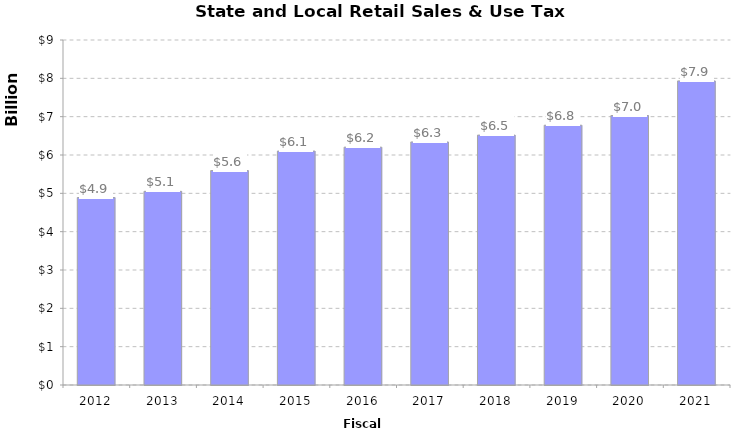
| Category | Series 0 |
|---|---|
| 2012.0 | 4891193000 |
| 2013.0 | 5052117000 |
| 2014.0 | 5594644000 |
| 2015.0 | 6102277000 |
| 2016.0 | 6204518000 |
| 2017.0 | 6340303000 |
| 2018.0 | 6519121000 |
| 2019.0 | 6776640000 |
| 2020.0 | 7029639000 |
| 2021.0 | 7933076000 |